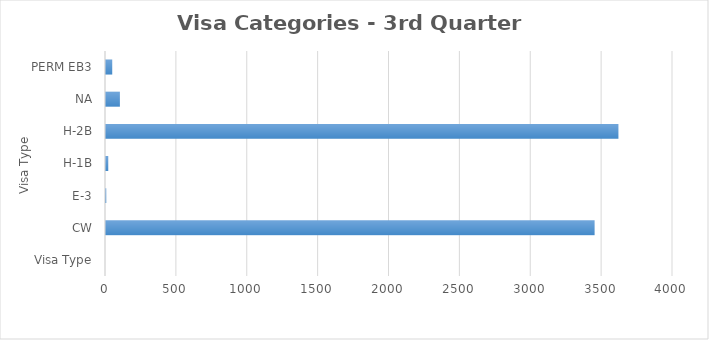
| Category | Series 0 |
|---|---|
| Visa Type | 0 |
| CW | 3447 |
| E-3 | 2 |
| H-1B | 16 |
| H-2B | 3615 |
| NA | 98 |
| PERM EB3 | 44 |